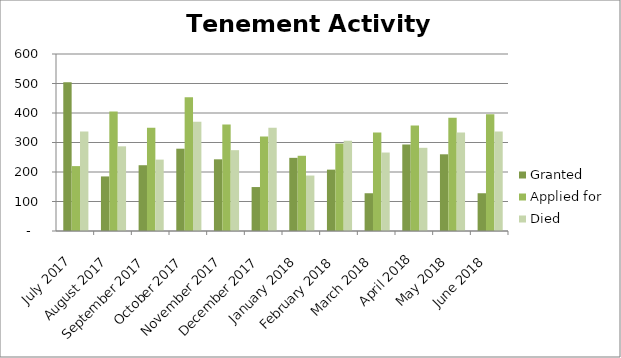
| Category | Granted | Applied for | Died |
|---|---|---|---|
| 2017-07-01 | 504 | 220 | 337 |
| 2017-08-01 | 185 | 405 | 287 |
| 2017-09-01 | 223 | 350 | 242 |
| 2017-10-01 | 279 | 453 | 370 |
| 2017-11-01 | 243 | 361 | 274 |
| 2017-12-01 | 149 | 320 | 350 |
| 2018-01-01 | 248 | 255 | 188 |
| 2018-02-01 | 208 | 297 | 306 |
| 2018-03-01 | 128 | 334 | 266 |
| 2018-04-01 | 293 | 358 | 282 |
| 2018-05-01 | 260 | 384 | 334 |
| 2018-06-01 | 128 | 396 | 337 |